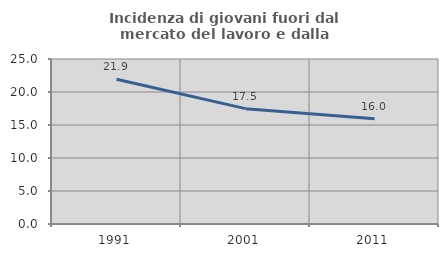
| Category | Incidenza di giovani fuori dal mercato del lavoro e dalla formazione  |
|---|---|
| 1991.0 | 21.932 |
| 2001.0 | 17.476 |
| 2011.0 | 15.96 |